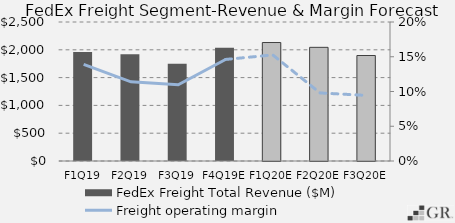
| Category | FedEx Freight Total Revenue ($M) |
|---|---|
|  F1Q19  | 1959.025 |
|  F2Q19  | 1917.798 |
|  F3Q19  | 1749.668 |
|  F4Q19E  | 2036.879 |
|  F1Q20E  | 2130.99 |
|  F2Q20E  | 2044.292 |
|  F3Q20E  | 1897.221 |